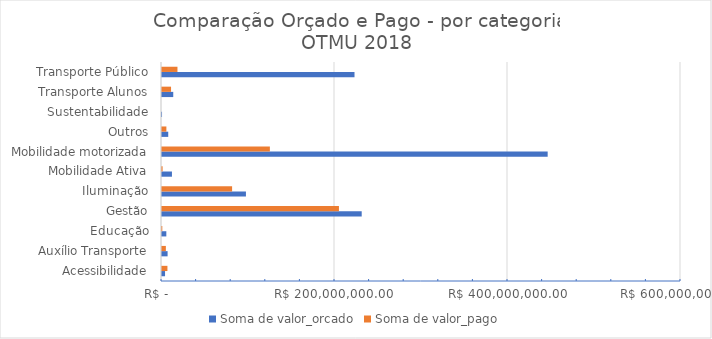
| Category | Soma de valor_orcado | Soma de valor_pago |
|---|---|---|
| Acessibilidade | 3516168 | 6283429.06 |
| Auxílio Transporte | 6460308 | 4472854.57 |
| Educação | 5001000 | 357640 |
| Gestão | 230867979 | 204558920.92 |
| Iluminação | 97037500 | 81041707.18 |
| Mobilidade Ativa | 11500689 | 690236.97 |
| Mobilidade motorizada | 445859974 | 124707028.19 |
| Outros | 7216411 | 5070428.54 |
| Sustentabilidade | 40000 | 0 |
| Transporte Alunos | 13002548 | 10453789.2 |
| Transporte Público | 222551257 | 17880411.94 |